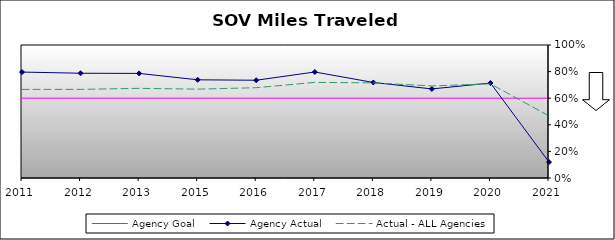
| Category | Agency Goal | Agency Actual | Actual - ALL Agencies |
|---|---|---|---|
| 2011.0 | 0.6 | 0.796 | 0.666 |
| 2012.0 | 0.6 | 0.788 | 0.666 |
| 2013.0 | 0.6 | 0.786 | 0.674 |
| 2015.0 | 0.6 | 0.738 | 0.668 |
| 2016.0 | 0.6 | 0.735 | 0.679 |
| 2017.0 | 0.6 | 0.797 | 0.719 |
| 2018.0 | 0.6 | 0.718 | 0.715 |
| 2019.0 | 0.6 | 0.67 | 0.692 |
| 2020.0 | 0.6 | 0.714 | 0.708 |
| 2021.0 | 0.6 | 0.12 | 0.467 |